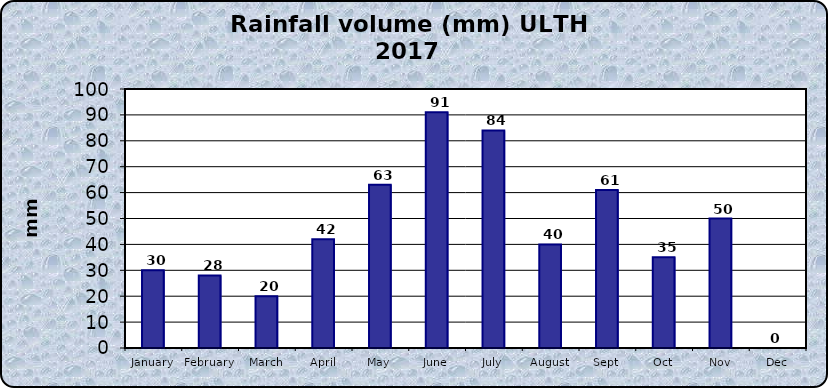
| Category | Series 0 |
|---|---|
| January | 30 |
| February | 28 |
| March | 20 |
| April | 42 |
| May | 63 |
| June | 91 |
| July | 84 |
| August | 40 |
| Sept | 61 |
| Oct | 35 |
| Nov | 50 |
| Dec | 0 |